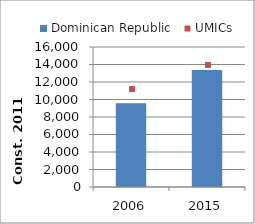
| Category | Dominican Republic |
|---|---|
| 2006.0 | 9576.583 |
| 2015.0 | 13371.529 |